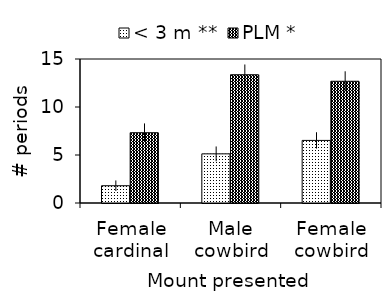
| Category | < 3 m ** | PLM * |
|---|---|---|
| Female cardinal | 1.8 | 7.32 |
| Male cowbird | 5.12 | 13.36 |
| Female cowbird | 6.52 | 12.68 |